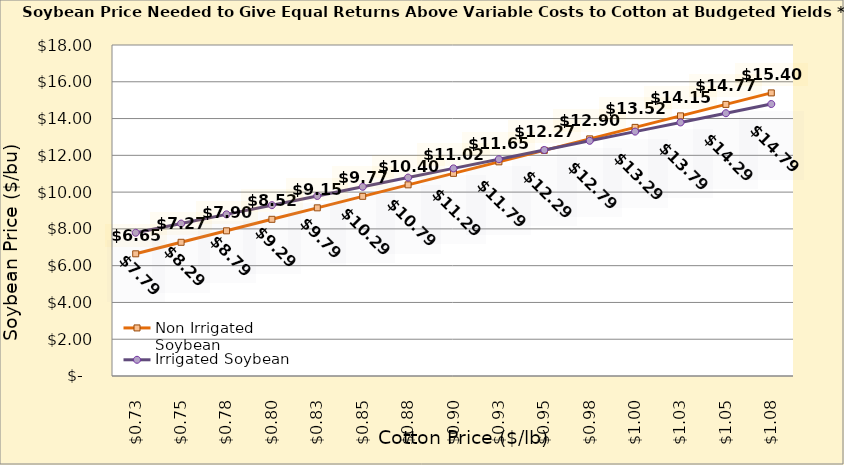
| Category | Non Irrigated Soybean | Irrigated Soybean |
|---|---|---|
| 0.7249999999999999 | 6.645 | 7.79 |
| 0.7499999999999999 | 7.27 | 8.29 |
| 0.7749999999999999 | 7.895 | 8.79 |
| 0.7999999999999999 | 8.52 | 9.29 |
| 0.825 | 9.145 | 9.79 |
| 0.85 | 9.77 | 10.29 |
| 0.875 | 10.395 | 10.79 |
| 0.9 | 11.02 | 11.29 |
| 0.925 | 11.645 | 11.79 |
| 0.9500000000000001 | 12.27 | 12.29 |
| 0.9750000000000001 | 12.895 | 12.79 |
| 1.0 | 13.52 | 13.29 |
| 1.025 | 14.145 | 13.79 |
| 1.0499999999999998 | 14.77 | 14.29 |
| 1.0749999999999997 | 15.395 | 14.79 |